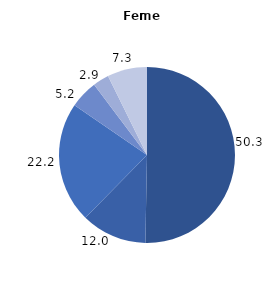
| Category | Series 0 |
|---|---|
| 0 | 50.297 |
| 1 | 12.049 |
| 2 | 22.241 |
| 3 | 5.16 |
| 4 | 2.948 |
| 5 | 7.306 |